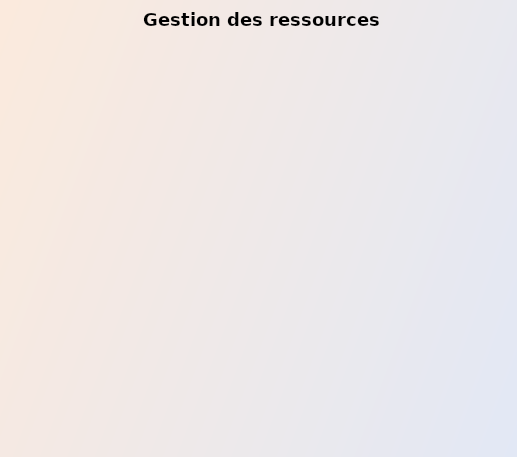
| Category | Series 0 |
|---|---|
| Manuel de l'employé  | 4 |
| Structure organisationnelle et profils des postes | 3.5 |
| Recrutement et rétention du personnel | 5 |
| Formation et développement professionnel | 3 |
| Évaluation du rendement | 2 |
| Gestion des rémunérations | 4 |
| Système de gestion des données pour les ressources humaines | 3 |